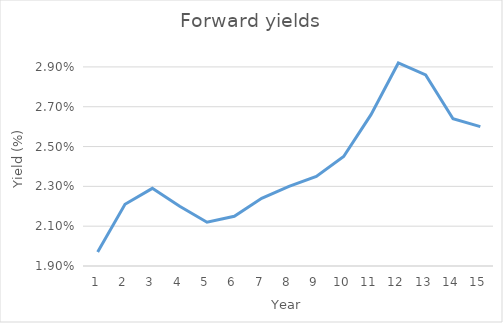
| Category | Series 0 |
|---|---|
| 0 | 0.02 |
| 1 | 0.022 |
| 2 | 0.023 |
| 3 | 0.022 |
| 4 | 0.021 |
| 5 | 0.022 |
| 6 | 0.022 |
| 7 | 0.023 |
| 8 | 0.024 |
| 9 | 0.024 |
| 10 | 0.027 |
| 11 | 0.029 |
| 12 | 0.029 |
| 13 | 0.026 |
| 14 | 0.026 |